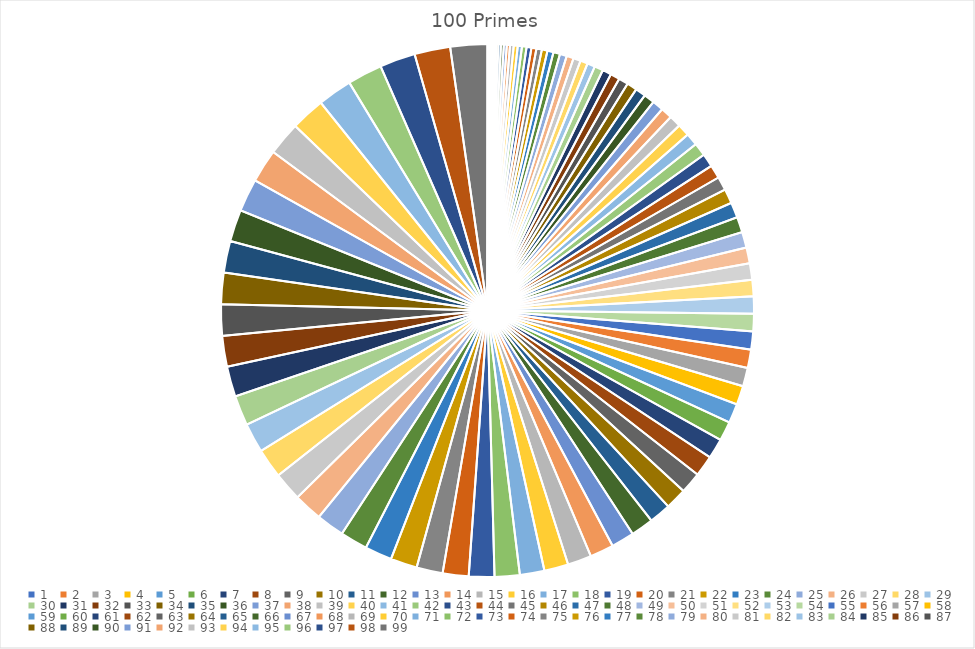
| Category | Series 0 |
|---|---|
| 0 | 3 |
| 1 | 5 |
| 2 | 7 |
| 3 | 11 |
| 4 | 13 |
| 5 | 17 |
| 6 | 19 |
| 7 | 23 |
| 8 | 29 |
| 9 | 31 |
| 10 | 37 |
| 11 | 41 |
| 12 | 43 |
| 13 | 47 |
| 14 | 53 |
| 15 | 59 |
| 16 | 61 |
| 17 | 67 |
| 18 | 71 |
| 19 | 73 |
| 20 | 79 |
| 21 | 83 |
| 22 | 89 |
| 23 | 97 |
| 24 | 101 |
| 25 | 103 |
| 26 | 107 |
| 27 | 109 |
| 28 | 113 |
| 29 | 127 |
| 30 | 131 |
| 31 | 137 |
| 32 | 139 |
| 33 | 149 |
| 34 | 151 |
| 35 | 157 |
| 36 | 163 |
| 37 | 167 |
| 38 | 173 |
| 39 | 179 |
| 40 | 181 |
| 41 | 191 |
| 42 | 193 |
| 43 | 197 |
| 44 | 199 |
| 45 | 211 |
| 46 | 223 |
| 47 | 227 |
| 48 | 229 |
| 49 | 233 |
| 50 | 239 |
| 51 | 241 |
| 52 | 251 |
| 53 | 257 |
| 54 | 263 |
| 55 | 269 |
| 56 | 271 |
| 57 | 277 |
| 58 | 281 |
| 59 | 283 |
| 60 | 293 |
| 61 | 307 |
| 62 | 311 |
| 63 | 313 |
| 64 | 317 |
| 65 | 331 |
| 66 | 337 |
| 67 | 347 |
| 68 | 349 |
| 69 | 353 |
| 70 | 359 |
| 71 | 367 |
| 72 | 373 |
| 73 | 379 |
| 74 | 383 |
| 75 | 389 |
| 76 | 397 |
| 77 | 401 |
| 78 | 409 |
| 79 | 419 |
| 80 | 421 |
| 81 | 431 |
| 82 | 433 |
| 83 | 439 |
| 84 | 443 |
| 85 | 449 |
| 86 | 457 |
| 87 | 461 |
| 88 | 463 |
| 89 | 467 |
| 90 | 479 |
| 91 | 487 |
| 92 | 491 |
| 93 | 499 |
| 94 | 503 |
| 95 | 509 |
| 96 | 521 |
| 97 | 523 |
| 98 | 541 |